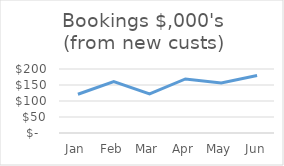
| Category | Bookings $,000's (new custs) |
|---|---|
| Jan | 121 |
| Feb | 161 |
| Mar | 122.5 |
| Apr | 169 |
| May | 156.6 |
| Jun | 179.8 |